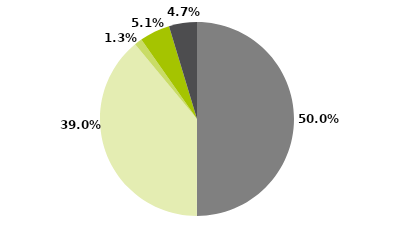
| Category | Series 0 |
|---|---|
| Multimercados Macro | 0.5 |
| Multimercados Livre | 0.39 |
| Multimercados L/S - Neutro | 0.013 |
| Multimercados L/S - Direcional | 0.051 |
| Outros | 0.047 |